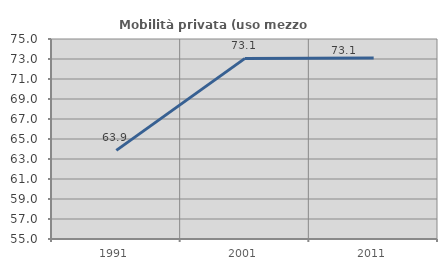
| Category | Mobilità privata (uso mezzo privato) |
|---|---|
| 1991.0 | 63.86 |
| 2001.0 | 73.062 |
| 2011.0 | 73.104 |